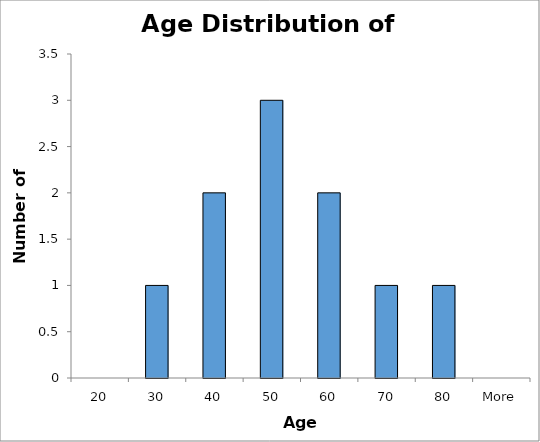
| Category | Frequency |
|---|---|
| 20 | 0 |
| 30 | 1 |
| 40 | 2 |
| 50 | 3 |
| 60 | 2 |
| 70 | 1 |
| 80 | 1 |
| More | 0 |